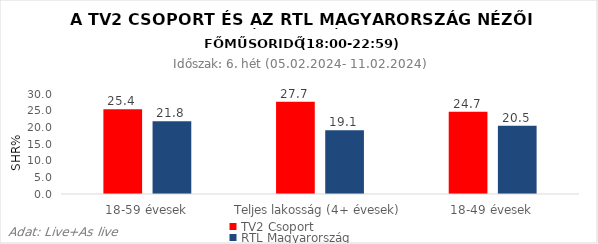
| Category | TV2 Csoport | RTL Magyarország |
|---|---|---|
| 18-59 évesek | 25.4 | 21.8 |
| Teljes lakosság (4+ évesek) | 27.7 | 19.1 |
| 18-49 évesek | 24.7 | 20.5 |